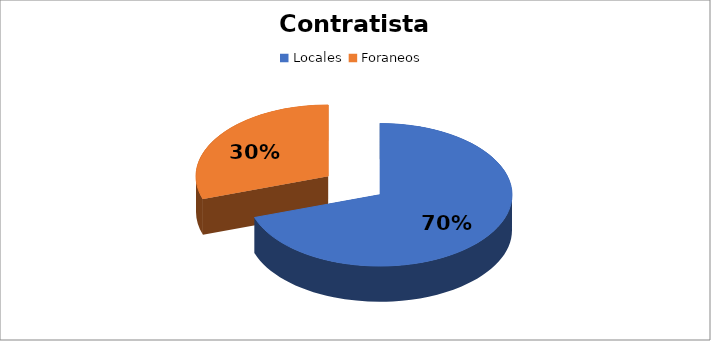
| Category | Suma |
|---|---|
| Locales  | 18736011.01 |
| Foraneos  | 8096413.6 |